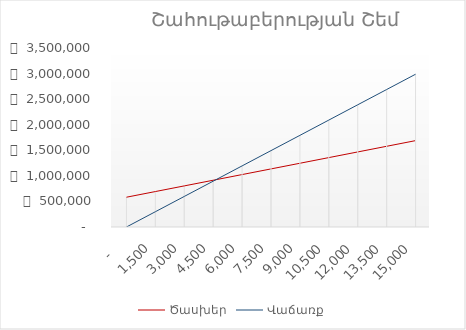
| Category | Ծասխեր | Վաճառք |
|---|---|---|
| 0.0 | 582500 | 0 |
| 1500.0 | 693130.357 | 298681.319 |
| 3000.0 | 803760.714 | 597362.637 |
| 4500.0 | 914391.071 | 896043.956 |
| 6000.0 | 1025021.429 | 1194725.275 |
| 7500.0 | 1135651.786 | 1493406.593 |
| 9000.0 | 1246282.143 | 1792087.912 |
| 10500.0 | 1356912.5 | 2090769.231 |
| 12000.0 | 1467542.857 | 2389450.549 |
| 13500.0 | 1578173.214 | 2688131.868 |
| 15000.0 | 1688803.571 | 2986813.187 |